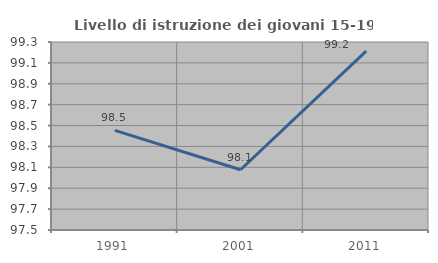
| Category | Livello di istruzione dei giovani 15-19 anni |
|---|---|
| 1991.0 | 98.454 |
| 2001.0 | 98.077 |
| 2011.0 | 99.213 |